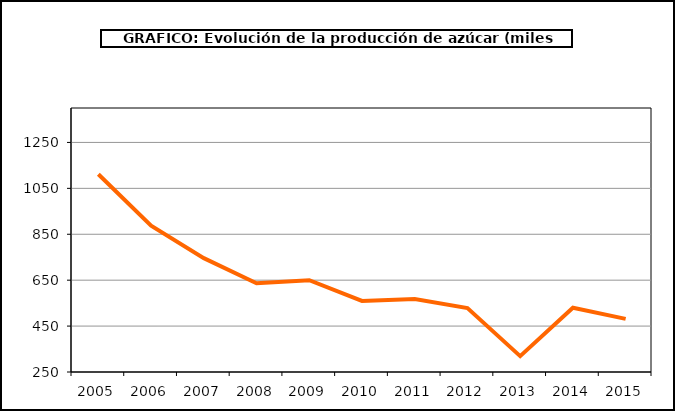
| Category | Producción |
|---|---|
| 2005.0 | 1111.213 |
| 2006.0 | 887.794 |
| 2007.0 | 745.869 |
| 2008.0 | 636.459 |
| 2009.0 | 649.935 |
| 2010.0 | 559.795 |
| 2011.0 | 567.722 |
| 2012.0 | 528.414 |
| 2013.0 | 319.237 |
| 2014.0 | 529.794 |
| 2015.0 | 481.569 |